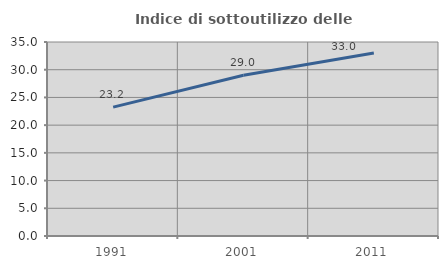
| Category | Indice di sottoutilizzo delle abitazioni  |
|---|---|
| 1991.0 | 23.247 |
| 2001.0 | 28.998 |
| 2011.0 | 33.011 |